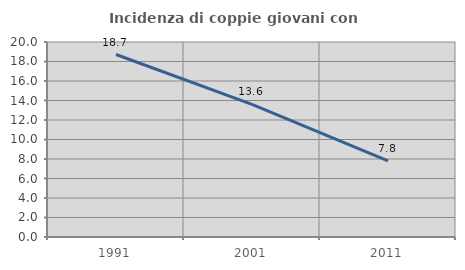
| Category | Incidenza di coppie giovani con figli |
|---|---|
| 1991.0 | 18.718 |
| 2001.0 | 13.597 |
| 2011.0 | 7.809 |